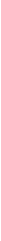
| Category | Máximo | Promedio | Mínimo | Mediano |
|---|---|---|---|---|
| D. Leg. 276 | 6162 | 2167.22 | 862.07 | 2043.39 |
| D. Leg. 728 | 2350.73 | 1593.05 | 1000 | 1563.4 |
| CAS | 7000 | 1275.22 | 850 | 1000 |
| Locación de servicios | 5500 | 1408.8 | 900 | 1200 |